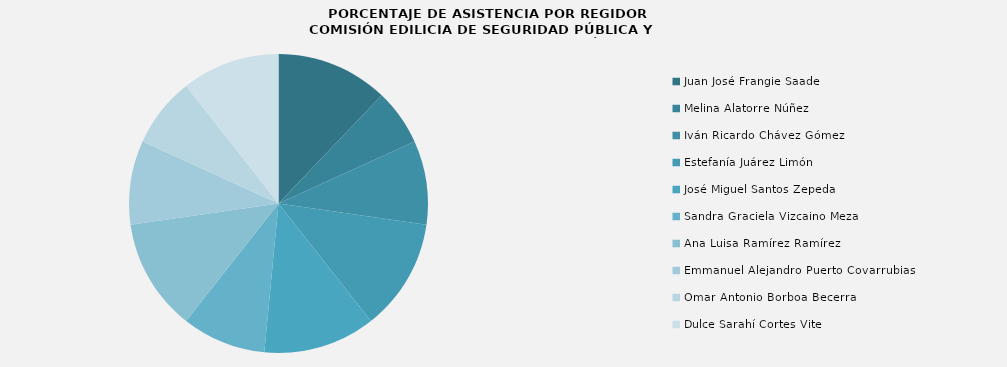
| Category | Series 0 |
|---|---|
| Juan José Frangie Saade | 100 |
| Melina Alatorre Núñez | 50 |
| Iván Ricardo Chávez Gómez | 75 |
| Estefanía Juárez Limón | 100 |
| José Miguel Santos Zepeda | 100 |
| Sandra Graciela Vizcaino Meza | 75 |
| Ana Luisa Ramírez Ramírez | 100 |
| Emmanuel Alejandro Puerto Covarrubias | 75 |
| Omar Antonio Borboa Becerra | 62.5 |
| Dulce Sarahí Cortes Vite | 87.5 |